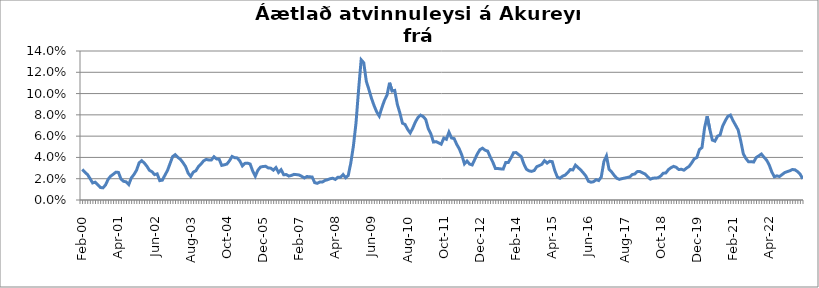
| Category | Series 0 |
|---|---|
| feb.00 | 0.029 |
| mar.00 | 0.026 |
| apr.00 | 0.024 |
| maí.00 | 0.02 |
| jún.00 | 0.016 |
| júl.00 | 0.017 |
| ágú.00 | 0.014 |
| sep.00 | 0.012 |
| okt.00 | 0.011 |
| nóv.00 | 0.014 |
| des.00 | 0.019 |
| jan.01 | 0.022 |
| feb.01 | 0.024 |
| mar.01 | 0.026 |
| apr.01 | 0.026 |
| maí.01 | 0.02 |
| jún.01 | 0.018 |
| júl.01 | 0.017 |
| ágú.01 | 0.014 |
| sep.01 | 0.021 |
| okt.01 | 0.024 |
| nóv.01 | 0.028 |
| des.01 | 0.035 |
| jan.02 | 0.037 |
| feb.02 | 0.035 |
| mar.02 | 0.032 |
| apr.02 | 0.028 |
| maí.02 | 0.027 |
| jún.02 | 0.024 |
| júl.02 | 0.025 |
| ágú.02 | 0.018 |
| sep.02 | 0.019 |
| okt.02 | 0.023 |
| nóv.02 | 0.028 |
| des.02 | 0.034 |
| jan.03 | 0.041 |
| feb.03 | 0.043 |
| mar.03 | 0.04 |
| apr.03 | 0.038 |
| maí.03 | 0.035 |
| jún.03 | 0.031 |
| júl.03 | 0.025 |
| ágú.03 | 0.022 |
| sep.03 | 0.026 |
| okt.03 | 0.028 |
| nóv.03 | 0.032 |
| des.03 | 0.034 |
| jan.04 | 0.037 |
| feb.04 | 0.038 |
| mar.04 | 0.038 |
| apr.04 | 0.038 |
| maí.04 | 0.041 |
| jún.04 | 0.039 |
| júl.04 | 0.038 |
| ágú.04 | 0.032 |
| sep.04 | 0.033 |
| okt.04 | 0.034 |
| nóv.04 | 0.037 |
| des.04 | 0.041 |
| jan.05 | 0.04 |
| feb.05 | 0.04 |
| mar.05 | 0.037 |
| apr.05 | 0.032 |
| maí.05 | 0.034 |
| jún.05 | 0.035 |
| júl.05 | 0.034 |
| ágú.05 | 0.027 |
| sep.05 | 0.022 |
| okt.05 | 0.028 |
| nóv.05 | 0.031 |
| des.05 | 0.031 |
| jan.06 | 0.032 |
| feb.06 | 0.03 |
| mar.06 | 0.03 |
| apr.06 | 0.028 |
| maí.06 | 0.03 |
| jún.06 | 0.026 |
| júl.06 | 0.028 |
| ágú.06 | 0.024 |
| sep.06 | 0.024 |
| okt.06 | 0.022 |
| nóv.06 | 0.023 |
| des.06 | 0.024 |
| jan.07 | 0.024 |
| feb.07 | 0.024 |
| mar.07 | 0.022 |
| apr.07 | 0.021 |
| maí.07 | 0.022 |
| jún.07 | 0.022 |
| júl.07 | 0.022 |
| ágú.07 | 0.016 |
| sep.07 | 0.016 |
| okt.07 | 0.017 |
| nóv.07 | 0.017 |
| des.07 | 0.018 |
| jan.08 | 0.019 |
| feb.08 | 0.02 |
| mar.08 | 0.02 |
| apr.08 | 0.019 |
| maí.08 | 0.021 |
| jún.08 | 0.021 |
| júl.08 | 0.024 |
| ágú.08 | 0.021 |
| sep.08 | 0.023 |
| okt.08 | 0.035 |
| nóv.08 | 0.051 |
| des.08 | 0.072 |
| jan.09 | 0.104 |
| feb.09 | 0.132 |
| mar.09 | 0.129 |
| apr.09 | 0.111 |
| maí.09 | 0.104 |
| jún.09 | 0.096 |
| júl.09 | 0.089 |
| ágú.09 | 0.083 |
| sep.09 | 0.079 |
| okt.09 | 0.087 |
| nóv.09 | 0.094 |
| des.09 | 0.098 |
| jan.10 | 0.11 |
| feb.10 | 0.102 |
| mar.10 | 0.103 |
| apr.10 | 0.09 |
| maí.10 | 0.082 |
| jún.10 | 0.072 |
| júl.10 | 0.071 |
| ágú.10 | 0.066 |
| sep.10 | 0.063 |
| okt.10 | 0.068 |
| nóv.10 | 0.073 |
| des.10 | 0.077 |
| jan.11 | 0.08 |
| feb.11 | 0.078 |
| mar.11 | 0.076 |
| apr.11 | 0.067 |
| maí.11 | 0.062 |
| jún.11 | 0.054 |
| júl.11 | 0.055 |
| ágú.11 | 0.054 |
| sep.11 | 0.052 |
| okt.11 | 0.058 |
| nóv.11 | 0.057 |
| des.11 | 0.064 |
| jan.12 | 0.058 |
| feb.12 | 0.058 |
| mar.12 | 0.052 |
| apr.12 | 0.048 |
| maí.12 | 0.042 |
| jún.12 | 0.034 |
| júl.12 | 0.037 |
| ágú.12 | 0.034 |
| sep.12 | 0.033 |
| okt.12 | 0.038 |
| nóv.12 | 0.043 |
| des.12 | 0.047 |
| jan.13 | 0.049 |
| feb.13 | 0.047 |
| mar.13 | 0.046 |
| apr.13 | 0.04 |
| maí.13 | 0.036 |
| jún.13 | 0.03 |
| júl.13 | 0.03 |
| ágú.13 | 0.029 |
| sep.13 | 0.029 |
| okt.13 | 0.035 |
| nóv.13 | 0.035 |
| des.13 | 0.039 |
| jan.14 | 0.044 |
| feb.14 | 0.045 |
| mar.14 | 0.043 |
| apr.14 | 0.041 |
| maí.14 | 0.034 |
| jún.14 | 0.029 |
| júl.14 | 0.027 |
| ágú.14 | 0.027 |
| sep.14 | 0.028 |
| okt.14 | 0.031 |
| nóv.14 | 0.032 |
| des.14 | 0.034 |
| jan.15 | 0.037 |
| feb.15 | 0.035 |
| mar.15 | 0.036 |
| apr.15 | 0.036 |
| maí.15 | 0.028 |
| jún.15 | 0.021 |
| júl.15 | 0.02 |
| ágú.15 | 0.022 |
| sep.15 | 0.023 |
| okt.15 | 0.026 |
| nóv.15 | 0.029 |
| des.15 | 0.028 |
| jan.16 | 0.033 |
| feb.16 | 0.03 |
| mar.16 | 0.028 |
| apr.16 | 0.026 |
| maí.16 | 0.023 |
| jún.16 | 0.018 |
| júl.16 | 0.017 |
| ágú.16 | 0.017 |
| sep.16 | 0.019 |
| okt.16 | 0.018 |
| nóv.16 | 0.022 |
| des.16 | 0.036 |
| jan.17 | 0.041 |
| feb.17 | 0.029 |
| mar.17 | 0.026 |
| apr.17 | 0.023 |
| maí.17 | 0.02 |
| jún.17 | 0.019 |
| júl.17 | 0.02 |
| ágú.17 | 0.021 |
| sep.17 | 0.021 |
| okt.17 | 0.022 |
| nóv.17 | 0.024 |
| des.17 | 0.024 |
| jan.18 | 0.027 |
| feb.18 | 0.027 |
| mar.18 | 0.025 |
| apr.18 | 0.024 |
| maí.18 | 0.022 |
| jún.18 | 0.02 |
| júl.18 | 0.021 |
| ágú.18 | 0.021 |
| sep.18 | 0.021 |
| okt.18 | 0.023 |
| nóv.18 | 0.025 |
| des.18 | 0.025 |
| jan.19 | 0.029 |
| feb.19 | 0.03 |
| mar.19 | 0.032 |
| apr.19 | 0.031 |
| maí.19 | 0.029 |
| jún.19 | 0.029 |
| júl.19 | 0.028 |
| ágú.19 | 0.03 |
| sep.19 | 0.032 |
| okt.19 | 0.035 |
| nóv.19 | 0.039 |
| des.19 | 0.04 |
| jan.20 | 0.047 |
| feb.20 | 0.049 |
| mars 2020*** | 0.068 |
| apr.20 | 0.079 |
| maí.20 | 0.067 |
| jún.20 | 0.056 |
| júl.20 | 0.055 |
| ágú.20 | 0.06 |
| sep.20 | 0.061 |
| okt.20 | 0.07 |
| nóv.20 | 0.074 |
| des.20 | 0.079 |
| jan.21 | 0.08 |
| feb.21 | 0.075 |
| mar.21 | 0.07 |
| apr.21 | 0.066 |
| maí.21 | 0.055 |
| jún.21 | 0.043 |
| júl.21 | 0.039 |
| ágú.21 | 0.036 |
| sep.21 | 0.036 |
| okt.21 | 0.036 |
| nóv.21 | 0.04 |
| des.21 | 0.042 |
| jan.22 | 0.043 |
| feb.22 | 0.04 |
| mar.22 | 0.038 |
| apr.22 | 0.033 |
| maí.22 | 0.027 |
| jún.22 | 0.022 |
| júl.22 | 0.023 |
| ágú.22 | 0.022 |
| sep.22 | 0.024 |
| okt.22 | 0.026 |
| nóv.22 | 0.027 |
| des.22 | 0.027 |
| jan.23 | 0.029 |
| feb.23 | 0.028 |
| mar.23 | 0.027 |
| apr.23 | 0.024 |
| maí.23 | 0.02 |